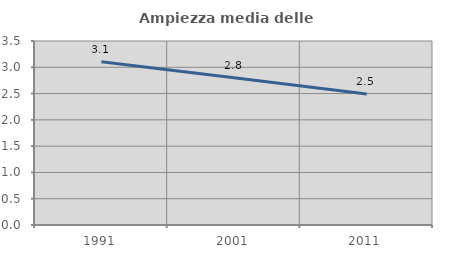
| Category | Ampiezza media delle famiglie |
|---|---|
| 1991.0 | 3.103 |
| 2001.0 | 2.8 |
| 2011.0 | 2.491 |